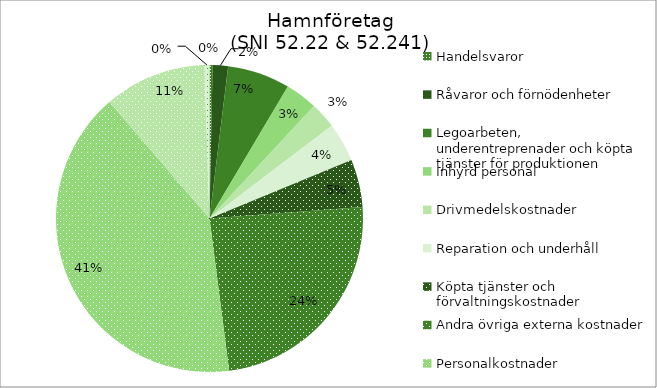
| Category | Series 0 |
|---|---|
| Handelsvaror | 28.592 |
| Råvaror och förnödenheter | 142.805 |
| Legoarbeten, underentreprenader och köpta tjänster för produktionen | 579.644 |
| Inhyrd personal | 298.813 |
| Drivmedelskostnader | 241.384 |
| Reparation och underhåll | 361.379 |
| Köpta tjänster och förvaltningskostnader | 444.196 |
| Andra övriga externa kostnader | 2125.991 |
| Personalkostnader | 3588.152 |
| Avskrivningar | 947.523 |
| Övriga rörelsekostnader | 46.871 |